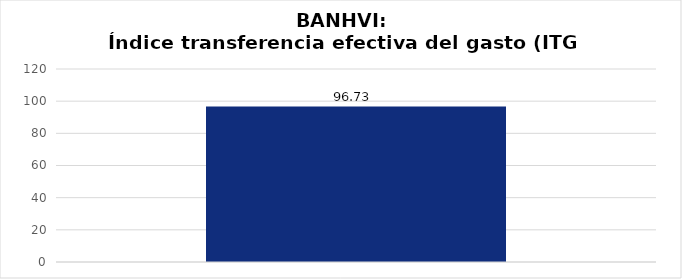
| Category | Índice transferencia efectiva del gasto (ITG) |
|---|---|
|  | 96.725 |